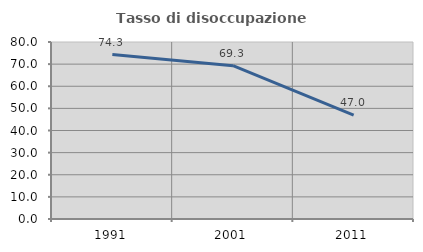
| Category | Tasso di disoccupazione giovanile  |
|---|---|
| 1991.0 | 74.34 |
| 2001.0 | 69.291 |
| 2011.0 | 46.988 |